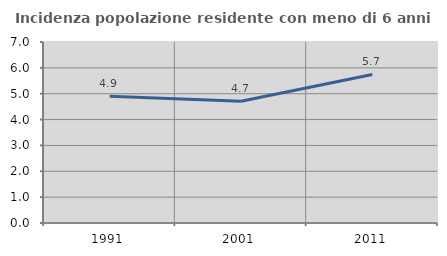
| Category | Incidenza popolazione residente con meno di 6 anni |
|---|---|
| 1991.0 | 4.897 |
| 2001.0 | 4.71 |
| 2011.0 | 5.746 |